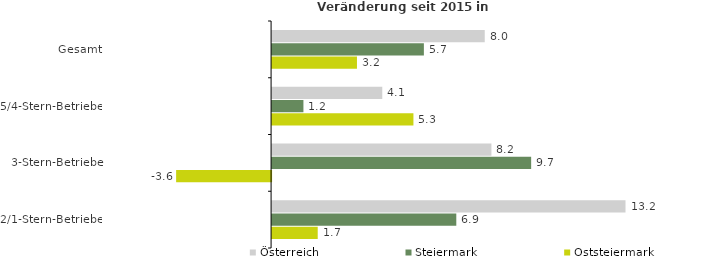
| Category | Österreich | Steiermark | Oststeiermark |
|---|---|---|---|
| Gesamt | 7.97 | 5.689 | 3.181 |
| 5/4-Stern-Betriebe | 4.13 | 1.174 | 5.297 |
| 3-Stern-Betriebe | 8.22 | 9.709 | -3.559 |
| 2/1-Stern-Betriebe | 13.246 | 6.904 | 1.71 |